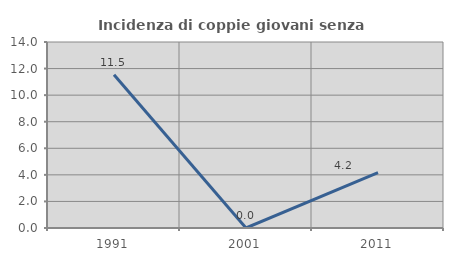
| Category | Incidenza di coppie giovani senza figli |
|---|---|
| 1991.0 | 11.538 |
| 2001.0 | 0 |
| 2011.0 | 4.167 |